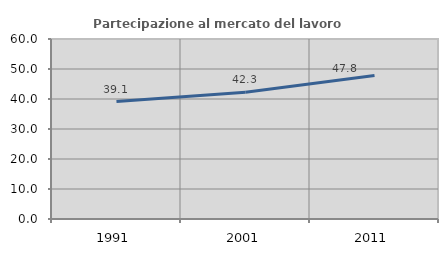
| Category | Partecipazione al mercato del lavoro  femminile |
|---|---|
| 1991.0 | 39.129 |
| 2001.0 | 42.255 |
| 2011.0 | 47.803 |